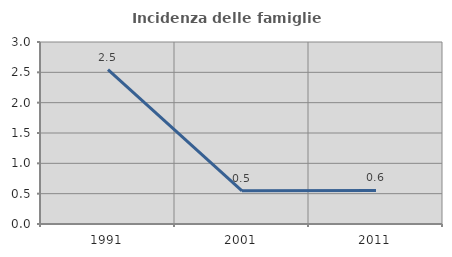
| Category | Incidenza delle famiglie numerose |
|---|---|
| 1991.0 | 2.543 |
| 2001.0 | 0.546 |
| 2011.0 | 0.554 |